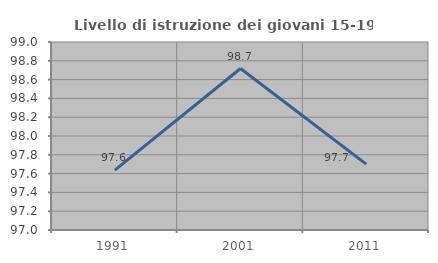
| Category | Livello di istruzione dei giovani 15-19 anni |
|---|---|
| 1991.0 | 97.638 |
| 2001.0 | 98.718 |
| 2011.0 | 97.701 |